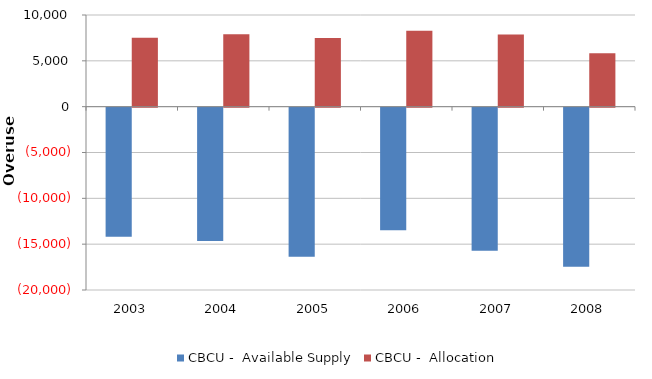
| Category | CBCU -  Available Supply | CBCU -  Allocation |
|---|---|---|
| 2003.0 | -14070 | 7520 |
| 2004.0 | -14540 | 7910 |
| 2005.0 | -16250 | 7490 |
| 2006.0 | -13360 | 8290 |
| 2007.0 | -15620 | 7860 |
| 2008.0 | -17360 | 5820 |